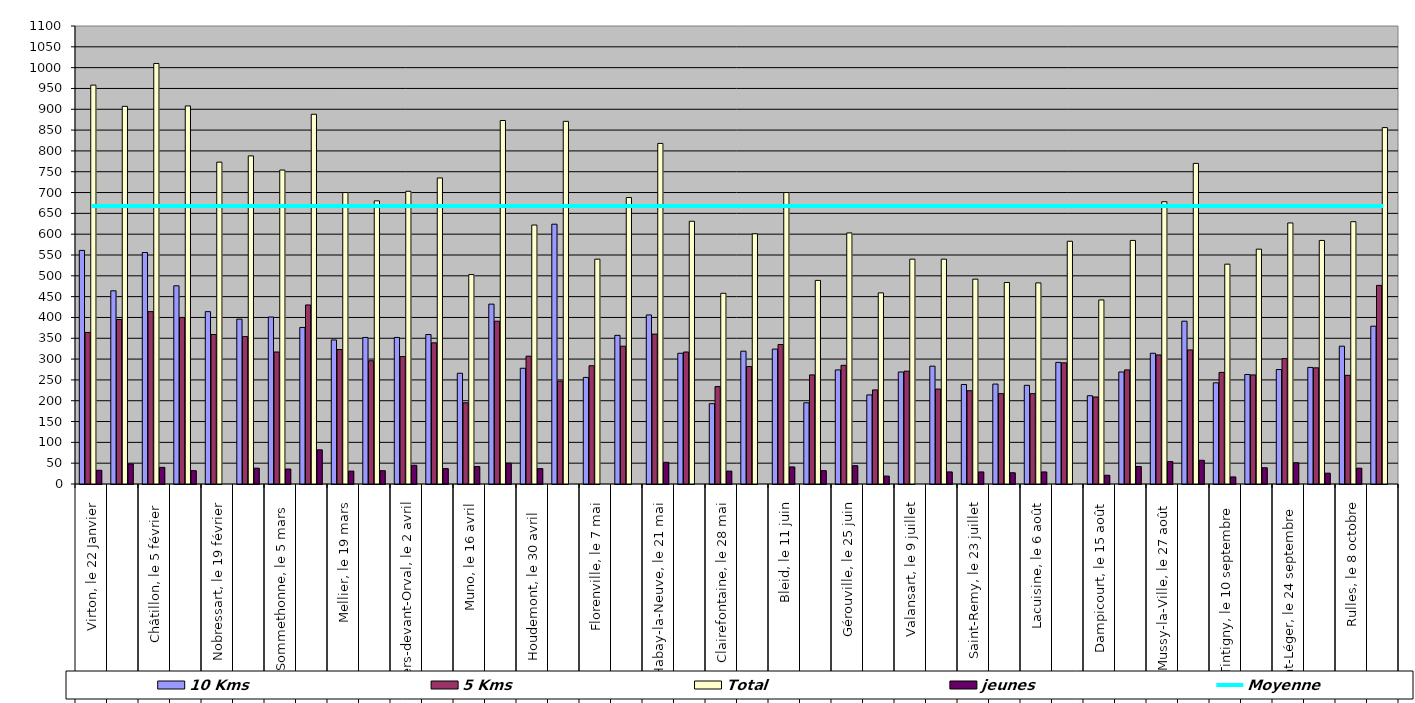
| Category | 10 Kms | 5 Kms | Total | jeunes |
|---|---|---|---|---|
| 0 | 561 | 364 | 958 | 33 |
| 1 | 464 | 395 | 907 | 48 |
| 2 | 556 | 414 | 1010 | 40 |
| 3 | 476 | 400 | 908 | 32 |
| 4 | 414 | 359 | 773 | 0 |
| 5 | 396 | 354 | 788 | 38 |
| 6 | 401 | 317 | 754 | 36 |
| 7 | 376 | 430 | 888 | 82 |
| 8 | 346 | 323 | 700 | 31 |
| 9 | 352 | 296 | 680 | 32 |
| 10 | 352 | 306 | 703 | 45 |
| 11 | 359 | 339 | 735 | 37 |
| 12 | 266 | 195 | 503 | 42 |
| 13 | 432 | 391 | 873 | 50 |
| 14 | 278 | 307 | 622 | 37 |
| 15 | 624 | 247 | 871 | 0 |
| 16 | 256 | 284 | 540 | 0 |
| 17 | 357 | 331 | 688 | 0 |
| 18 | 406 | 360 | 818 | 52 |
| 19 | 314 | 317 | 631 | 0 |
| 20 | 193 | 234 | 458 | 31 |
| 21 | 319 | 282 | 601 | 0 |
| 22 | 324 | 335 | 700 | 41 |
| 23 | 195 | 262 | 489 | 32 |
| 24 | 274 | 285 | 603 | 44 |
| 25 | 214 | 226 | 459 | 19 |
| 26 | 269 | 271 | 540 | 0 |
| 27 | 283 | 228 | 540 | 29 |
| 28 | 239 | 224 | 492 | 29 |
| 29 | 240 | 217 | 484 | 27 |
| 30 | 237 | 217 | 483 | 29 |
| 31 | 292 | 291 | 583 | 0 |
| 32 | 212 | 209 | 442 | 21 |
| 33 | 269 | 274 | 585 | 42 |
| 34 | 314 | 310 | 678 | 54 |
| 35 | 391 | 322 | 770 | 57 |
| 36 | 243 | 268 | 528 | 17 |
| 37 | 263 | 262 | 564 | 39 |
| 38 | 275 | 301 | 627 | 51 |
| 39 | 280 | 279 | 585 | 26 |
| 40 | 331 | 261 | 630 | 38 |
| 41 | 379 | 477 | 856 | 0 |